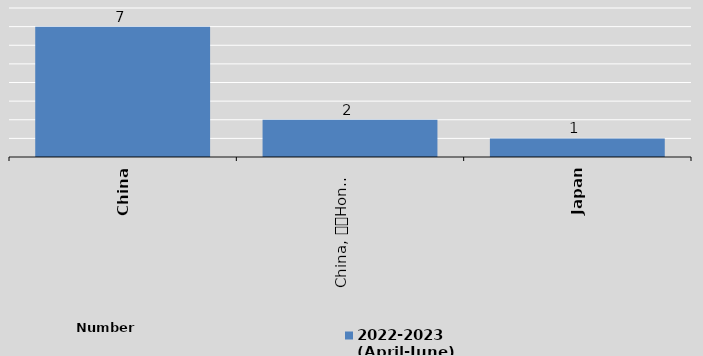
| Category | 2022-2023
(April-June)
 |
|---|---|
| China | 7 |
| China, 
Hong Kong SAR | 2 |
| Japan | 1 |